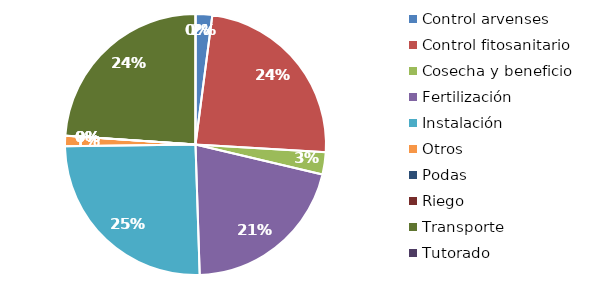
| Category | Valor |
|---|---|
| Control arvenses | 2085636 |
| Control fitosanitario | 24138133 |
| Cosecha y beneficio | 2790473.376 |
| Fertilización | 21018219 |
| Instalación | 25588206 |
| Otros | 1302224 |
| Podas | 0 |
| Riego | 0 |
| Transporte | 24185200 |
| Tutorado | 0 |